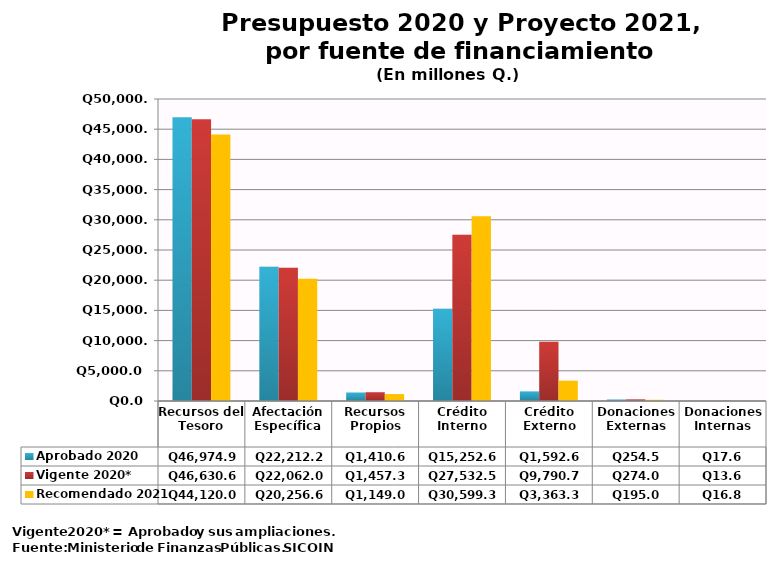
| Category | Aprobado 2020 | Vigente 2020* | Recomendado 2021 |
|---|---|---|---|
| Recursos del Tesoro | 46974.9 | 46630.6 | 44120 |
| Afectación Específica | 22212.2 | 22062 | 20256.6 |
| Recursos Propios | 1410.6 | 1457.3 | 1149 |
| Crédito Interno | 15252.6 | 27532.5 | 30599.3 |
| Crédito Externo | 1592.6 | 9790.7 | 3363.3 |
| Donaciones Externas | 254.5 | 274 | 195 |
| Donaciones Internas | 17.6 | 13.6 | 16.8 |